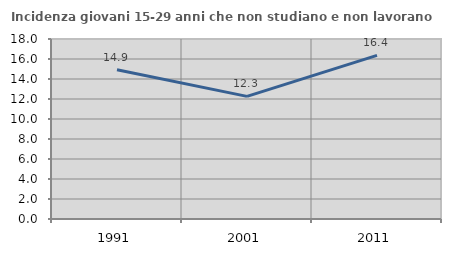
| Category | Incidenza giovani 15-29 anni che non studiano e non lavorano  |
|---|---|
| 1991.0 | 14.927 |
| 2001.0 | 12.264 |
| 2011.0 | 16.364 |